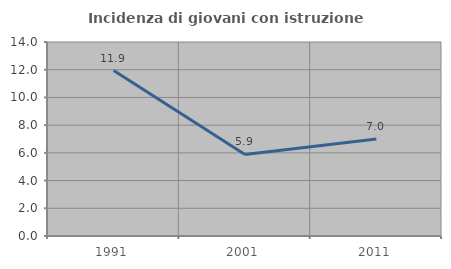
| Category | Incidenza di giovani con istruzione universitaria |
|---|---|
| 1991.0 | 11.94 |
| 2001.0 | 5.882 |
| 2011.0 | 7 |